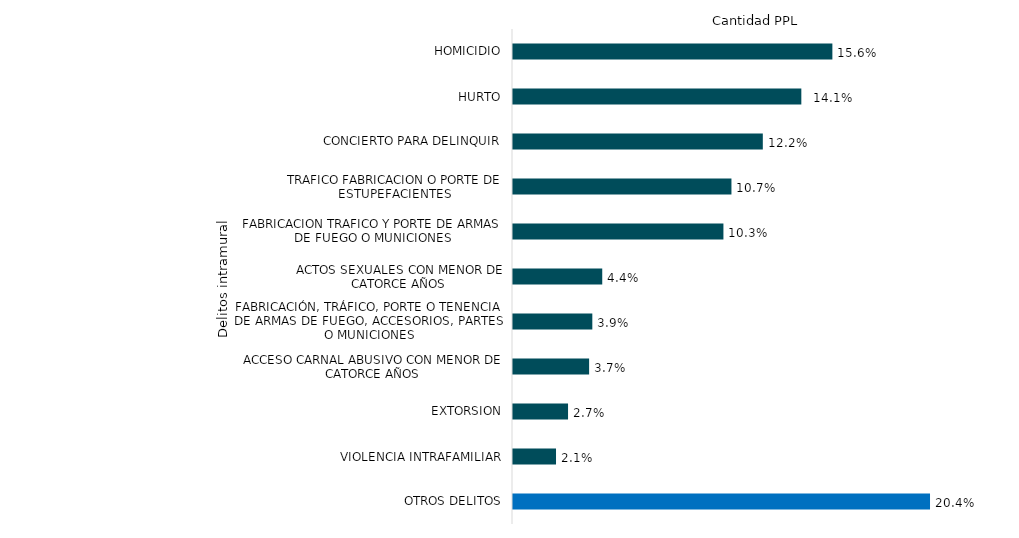
| Category | Total |
|---|---|
| HOMICIDIO | 25913 |
| HURTO | 23394 |
| CONCIERTO PARA DELINQUIR | 20269 |
| TRAFICO FABRICACION O PORTE DE ESTUPEFACIENTES | 17724 |
| FABRICACION TRAFICO Y PORTE DE ARMAS DE FUEGO O MUNICIONES | 17073 |
| ACTOS SEXUALES CON MENOR DE CATORCE AÑOS | 7241 |
| FABRICACIÓN, TRÁFICO, PORTE O TENENCIA DE ARMAS DE FUEGO, ACCESORIOS, PARTES O MUNICIONES | 6436 |
| ACCESO CARNAL ABUSIVO CON MENOR DE CATORCE AÑOS | 6176 |
| EXTORSION | 4466 |
| VIOLENCIA INTRAFAMILIAR | 3490 |
| OTROS DELITOS | 33835 |